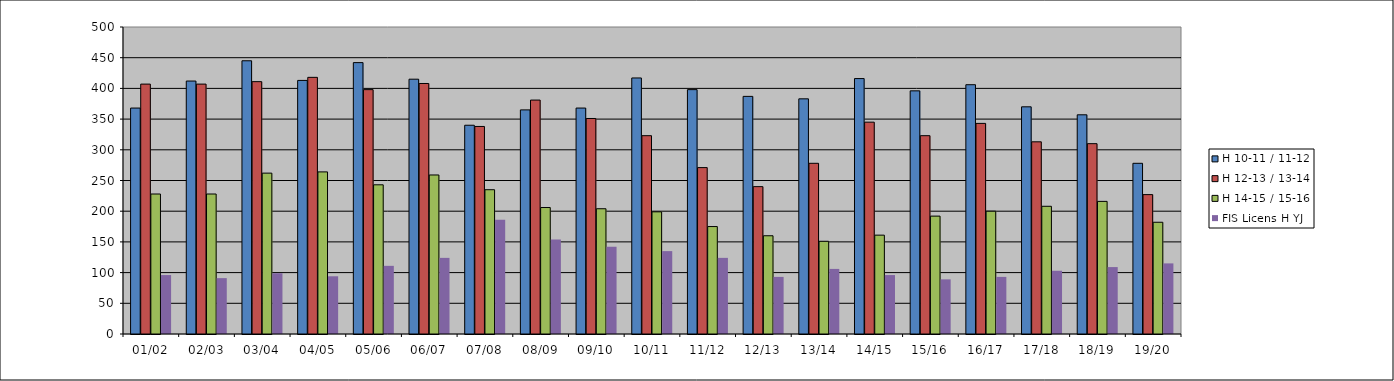
| Category | H 10-11 / 11-12 | H 12-13 / 13-14 | H 14-15 / 15-16 | FIS Licens H YJ |
|---|---|---|---|---|
| 01/02 | 368 | 407 | 228 | 96 |
| 02/03 | 412 | 407 | 228 | 91 |
| 03/04 | 445 | 411 | 262 | 99 |
| 04/05 | 413 | 418 | 264 | 94 |
| 05/06 | 442 | 398 | 243 | 111 |
| 06/07 | 415 | 408 | 259 | 124 |
| 07/08 | 340 | 338 | 235 | 186 |
| 08/09 | 365 | 381 | 206 | 154 |
| 09/10 | 368 | 351 | 204 | 142 |
| 10/11 | 417 | 323 | 199 | 135 |
| 11/12 | 398 | 271 | 175 | 124 |
| 12/13 | 387 | 240 | 160 | 93 |
| 13/14 | 383 | 278 | 151 | 106 |
| 14/15 | 416 | 345 | 161 | 96 |
| 15/16 | 396 | 323 | 192 | 89 |
| 16/17 | 406 | 343 | 200 | 93 |
| 17/18 | 370 | 313 | 208 | 103 |
| 18/19 | 357 | 310 | 216 | 109 |
| 19/20 | 278 | 227 | 182 | 115 |